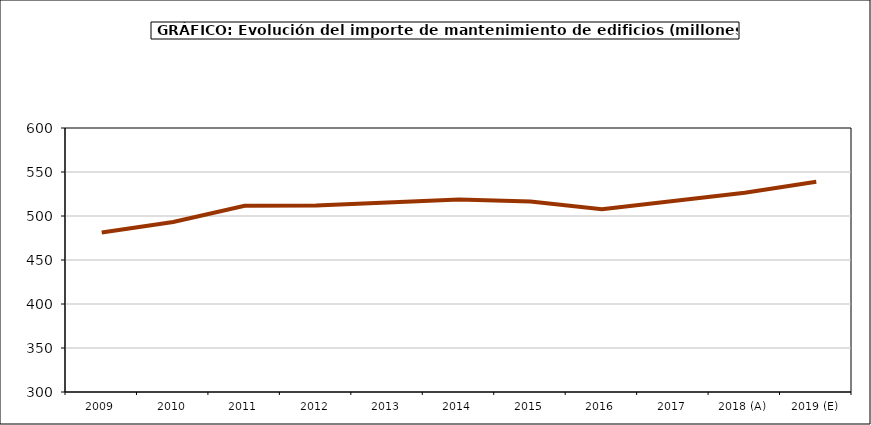
| Category | mantenimiento |
|---|---|
| 2009 | 481.186 |
| 2010 | 493.233 |
| 2011 | 511.585 |
| 2012 | 512.04 |
| 2013 | 515.387 |
| 2014 | 518.885 |
| 2015 | 516.507 |
| 2016 | 507.665 |
| 2017 | 516.979 |
| 2018 (A) | 526.414 |
| 2019 (E) | 538.84 |